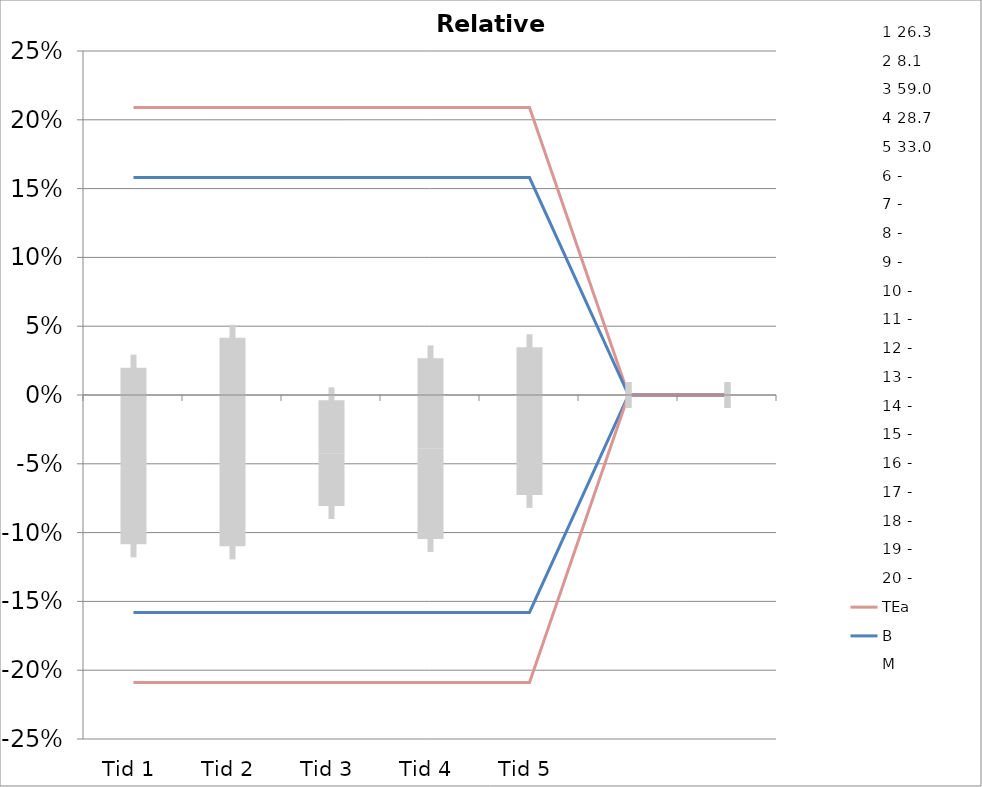
| Category | 1 | 2 | 3 | 4 | 5 | 6 | 7 | 8 | 9 | 10 | 11 | 12 | 13 | 14 | 15 | 16 | 17 | 18 | 19 | 20 | TEa | B | -B | -TEa | M |
|---|---|---|---|---|---|---|---|---|---|---|---|---|---|---|---|---|---|---|---|---|---|---|---|---|---|
| Tid 1 | -0.065 | -0.049 | -0.053 | 0.042 | -0.097 | 0 | 0 | 0 | 0 | 0 | 0 | 0 | 0 | 0 | 0 | 0 | 0 | 0 | 0 | 0 | 0.209 | 0.158 | -0.158 | -0.209 | -0.044 |
| Tid 2 | -0.049 | -0.062 | -0.054 | 0.073 | -0.079 | 0 | 0 | 0 | 0 | 0 | 0 | 0 | 0 | 0 | 0 | 0 | 0 | 0 | 0 | 0 | 0.209 | 0.158 | -0.158 | -0.209 | -0.034 |
| Tid 3 | -0.023 | -0.049 | -0.051 | -0.003 | -0.085 | 0 | 0 | 0 | 0 | 0 | 0 | 0 | 0 | 0 | 0 | 0 | 0 | 0 | 0 | 0 | 0.209 | 0.158 | -0.158 | -0.209 | -0.042 |
| Tid 4 | -0.011 | -0.062 | -0.044 | 0.031 | -0.109 | 0 | 0 | 0 | 0 | 0 | 0 | 0 | 0 | 0 | 0 | 0 | 0 | 0 | 0 | 0 | 0.209 | 0.158 | -0.158 | -0.209 | -0.039 |
| Tid 5 | -0.034 | 0.025 | -0.034 | 0.024 | -0.076 | 0 | 0 | 0 | 0 | 0 | 0 | 0 | 0 | 0 | 0 | 0 | 0 | 0 | 0 | 0 | 0.209 | 0.158 | -0.158 | -0.209 | -0.019 |